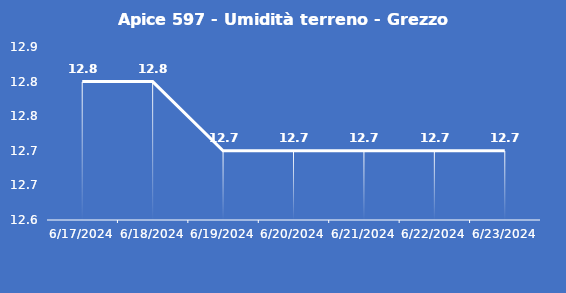
| Category | Apice 597 - Umidità terreno - Grezzo (%VWC) |
|---|---|
| 6/17/24 | 12.8 |
| 6/18/24 | 12.8 |
| 6/19/24 | 12.7 |
| 6/20/24 | 12.7 |
| 6/21/24 | 12.7 |
| 6/22/24 | 12.7 |
| 6/23/24 | 12.7 |